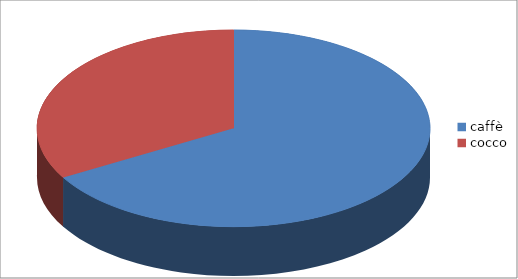
| Category | Series 0 |
|---|---|
| caffè | 100 |
| cocco | 50 |